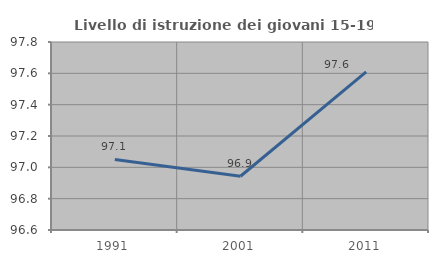
| Category | Livello di istruzione dei giovani 15-19 anni |
|---|---|
| 1991.0 | 97.05 |
| 2001.0 | 96.943 |
| 2011.0 | 97.61 |